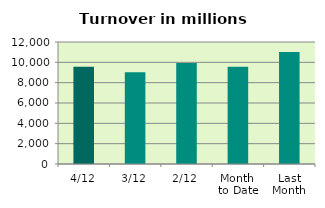
| Category | Series 0 |
|---|---|
| 4/12 | 9576.757 |
| 3/12 | 9036.021 |
| 2/12 | 9944.763 |
| Month 
to Date | 9575.994 |
| Last
Month | 11011.83 |